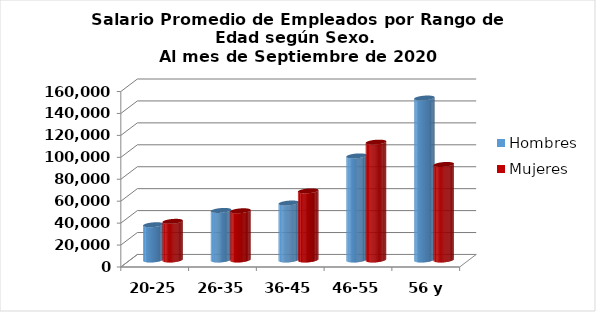
| Category | Hombres | Mujeres |
|---|---|---|
| 20-25 | 32150 | 35264 |
| 26-35 | 45189 | 44879 |
| 36-45 | 51965 | 63020 |
| 46-55 | 94911.577 | 107467 |
| 56 y más | 147693 | 87106 |